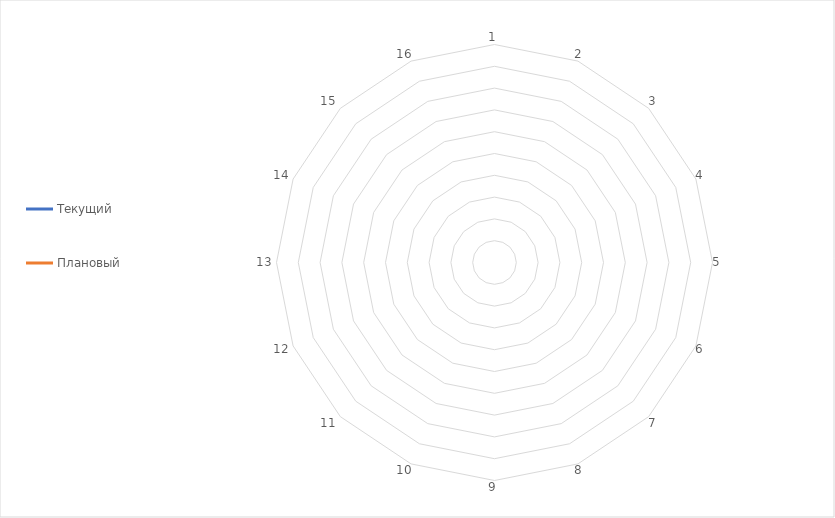
| Category | Текущий | Плановый |
|---|---|---|
| 1.0 | 0 | 0 |
| 2.0 | 0 | 0 |
| 3.0 | 0 | 0 |
| 4.0 | 0 | 0 |
| 5.0 | 0 | 0 |
| 6.0 | 0 | 0 |
| 7.0 | 0 | 0 |
| 8.0 | 0 | 0 |
| 9.0 | 0 | 0 |
| 10.0 | 0 | 0 |
| 11.0 | 0 | 0 |
| 12.0 | 0 | 0 |
| 13.0 | 0 | 0 |
| 14.0 | 0 | 0 |
| 15.0 | 0 | 0 |
| 16.0 | 0 | 0 |